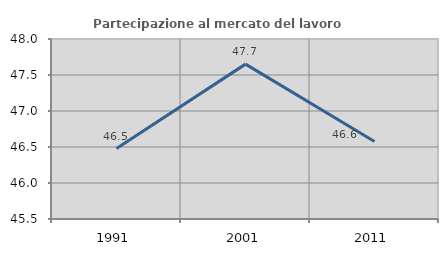
| Category | Partecipazione al mercato del lavoro  femminile |
|---|---|
| 1991.0 | 46.479 |
| 2001.0 | 47.651 |
| 2011.0 | 46.575 |